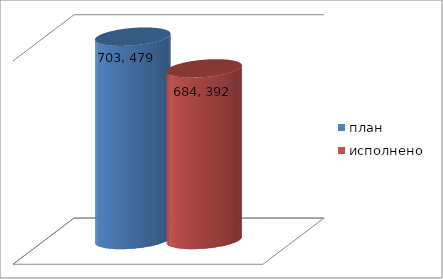
| Category | план | исполнено |
|---|---|---|
| 0 | 703479880.38 | 684392511.39 |